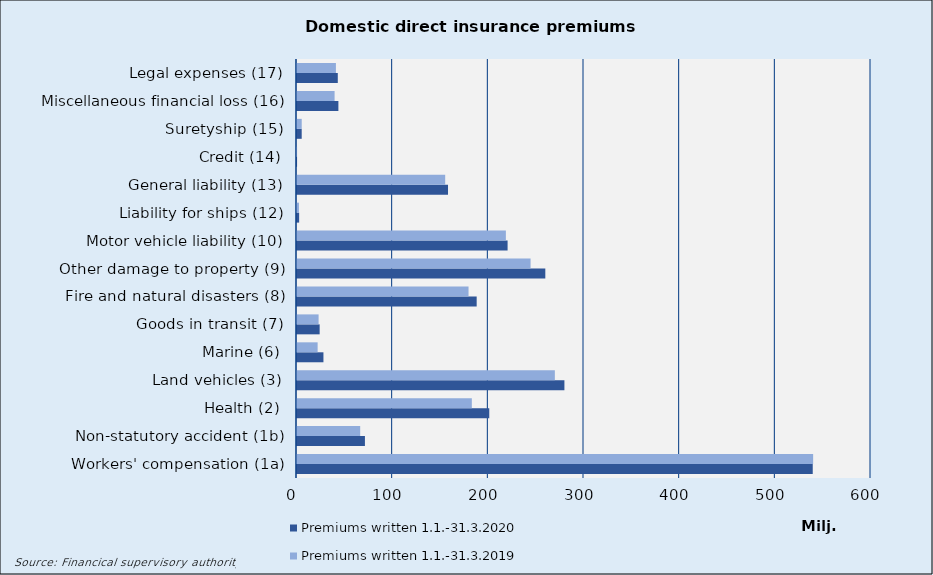
| Category | Premiums written |
|---|---|
| Workers' compensation (1a) | 539513.537 |
| Non-statutory accident (1b) | 66050.603 |
| Health (2) | 182750.453 |
| Land vehicles (3) | 269526.724 |
| Marine (6) | 21557.844 |
| Goods in transit (7) | 22576.198 |
| Fire and natural disasters (8) | 179312.245 |
| Other damage to property (9) | 244162.116 |
| Motor vehicle liability (10) | 218331.846 |
| Liability for ships (12) | 2032.137 |
| General liability (13) | 154905.83 |
| Credit (14) | 74.073 |
| Suretyship (15) | 4938.693 |
| Miscellaneous financial loss (16) | 39294.524 |
| Legal expenses (17) | 40669.128 |